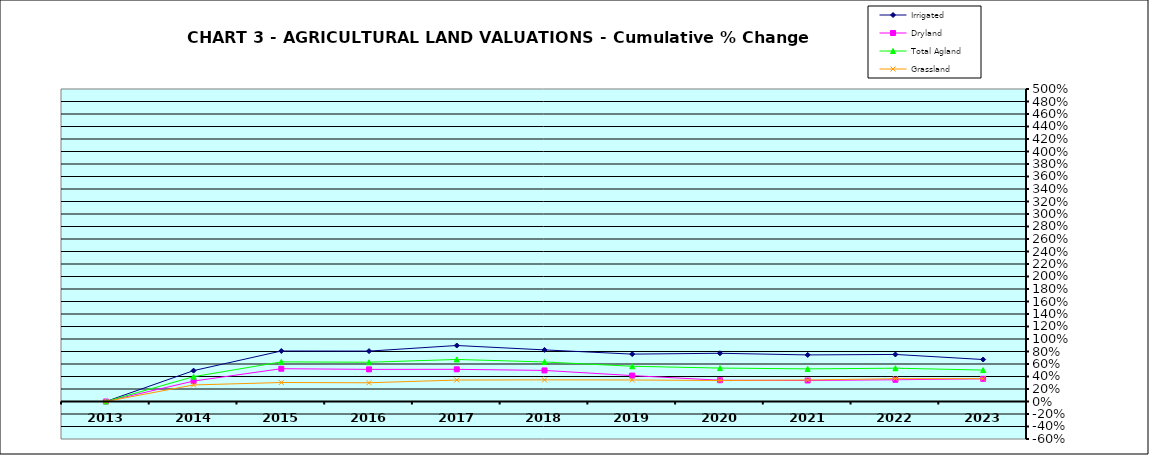
| Category | Irrigated | Dryland | Total Agland | Grassland |
|---|---|---|---|---|
| 2013.0 | 0 | 0 | 0 | 0 |
| 2014.0 | 0.494 | 0.327 | 0.397 | 0.265 |
| 2015.0 | 0.808 | 0.525 | 0.634 | 0.304 |
| 2016.0 | 0.806 | 0.514 | 0.628 | 0.3 |
| 2017.0 | 0.896 | 0.515 | 0.673 | 0.343 |
| 2018.0 | 0.826 | 0.497 | 0.633 | 0.346 |
| 2019.0 | 0.758 | 0.415 | 0.564 | 0.344 |
| 2020.0 | 0.772 | 0.34 | 0.535 | 0.336 |
| 2021.0 | 0.745 | 0.336 | 0.522 | 0.344 |
| 2022.0 | 0.753 | 0.348 | 0.533 | 0.365 |
| 2023.0 | 0.672 | 0.363 | 0.503 | 0.366 |